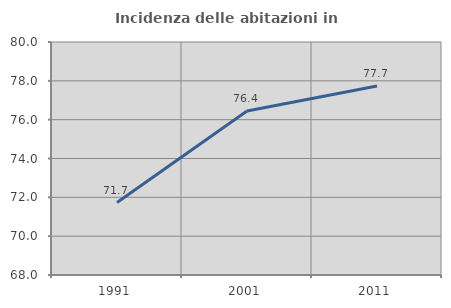
| Category | Incidenza delle abitazioni in proprietà  |
|---|---|
| 1991.0 | 71.731 |
| 2001.0 | 76.443 |
| 2011.0 | 77.736 |